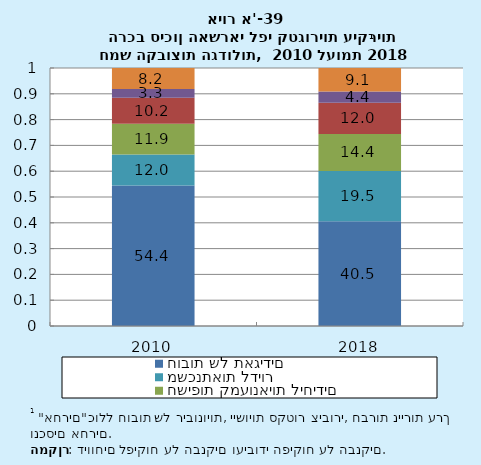
| Category | חובות של תאגידים | משכנתאות לדיור | חשיפות קמעונאיות ליחידים | חובות בביטחון נדל"ן מסחרי | הלוואות לעסקים קטנים | אחרים |
|---|---|---|---|---|---|---|
| 2010.0 | 54.41 | 12.018 | 11.92 | 10.158 | 3.312 | 8.182 |
| 2018.0 | 40.547 | 19.506 | 14.351 | 12.017 | 4.414 | 9.093 |